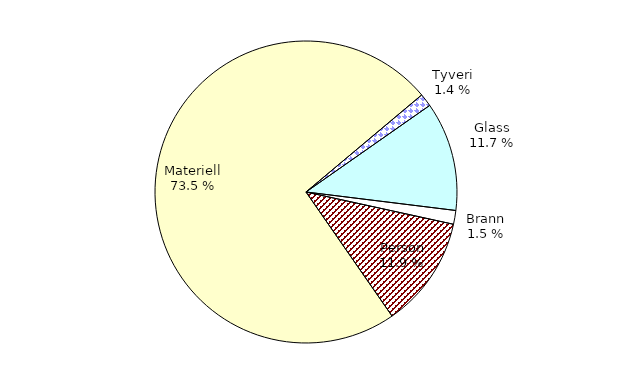
| Category | Series 0 |
|---|---|
| Tyveri | 95.491 |
| Glass | 800.299 |
| Brann | 100.954 |
| Person | 817.204 |
| Materiell | 5041.491 |